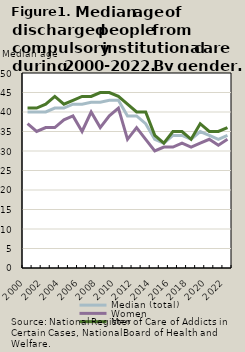
| Category | Median (total) | Women | Men |
|---|---|---|---|
| 2000.0 | 40 | 37 | 41 |
| 2001.0 | 40 | 35 | 41 |
| 2002.0 | 40 | 36 | 42 |
| 2003.0 | 41 | 36 | 44 |
| 2004.0 | 41 | 38 | 42 |
| 2005.0 | 42 | 39 | 43 |
| 2006.0 | 42 | 35 | 44 |
| 2007.0 | 42.5 | 40 | 44 |
| 2008.0 | 42.5 | 36 | 45 |
| 2009.0 | 43 | 39 | 45 |
| 2010.0 | 43 | 41 | 44 |
| 2011.0 | 39 | 33 | 42 |
| 2012.0 | 39 | 36 | 40 |
| 2013.0 | 37 | 33 | 40 |
| 2014.0 | 33 | 30 | 34 |
| 2015.0 | 32 | 31 | 32 |
| 2016.0 | 34 | 31 | 35 |
| 2017.0 | 34 | 32 | 35 |
| 2018.0 | 33 | 31 | 33 |
| 2019.0 | 35 | 32 | 37 |
| 2020.0 | 34 | 33 | 35 |
| 2021.0 | 33 | 31.5 | 35 |
| 2022.0 | 34 | 33 | 36 |